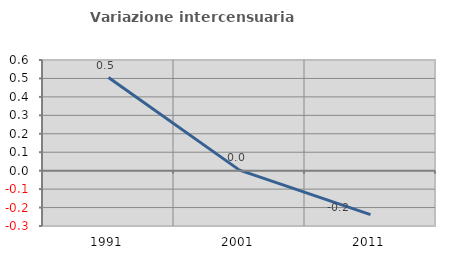
| Category | Variazione intercensuaria annua |
|---|---|
| 1991.0 | 0.505 |
| 2001.0 | 0.003 |
| 2011.0 | -0.238 |